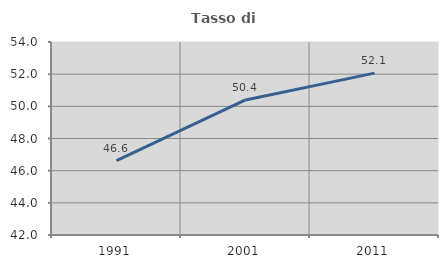
| Category | Tasso di occupazione   |
|---|---|
| 1991.0 | 46.628 |
| 2001.0 | 50.397 |
| 2011.0 | 52.067 |